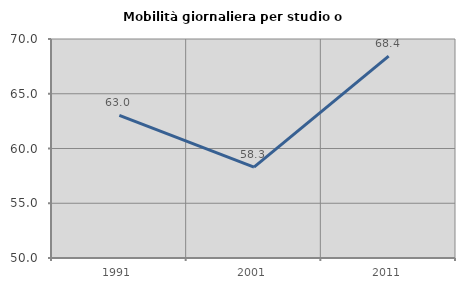
| Category | Mobilità giornaliera per studio o lavoro |
|---|---|
| 1991.0 | 63.018 |
| 2001.0 | 58.291 |
| 2011.0 | 68.443 |